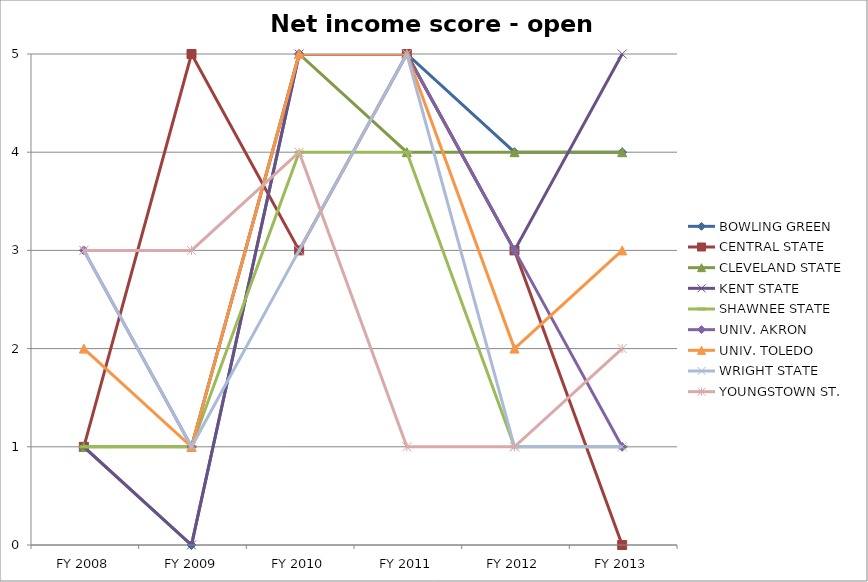
| Category | BOWLING GREEN  | CENTRAL STATE  | CLEVELAND STATE  | KENT STATE  | SHAWNEE STATE  | UNIV. AKRON  | UNIV. TOLEDO  | WRIGHT STATE  | YOUNGSTOWN ST.  |
|---|---|---|---|---|---|---|---|---|---|
| FY 2013 | 4 | 0 | 4 | 5 | 1 | 1 | 3 | 1 | 2 |
| FY 2012 | 4 | 3 | 4 | 3 | 1 | 3 | 2 | 1 | 1 |
| FY 2011 | 5 | 5 | 4 | 5 | 4 | 5 | 5 | 5 | 1 |
| FY 2010 | 5 | 3 | 5 | 5 | 4 | 5 | 5 | 3 | 4 |
| FY 2009 | 0 | 5 | 1 | 0 | 1 | 1 | 1 | 1 | 3 |
| FY 2008 | 1 | 1 | 1 | 1 | 1 | 3 | 2 | 3 | 3 |